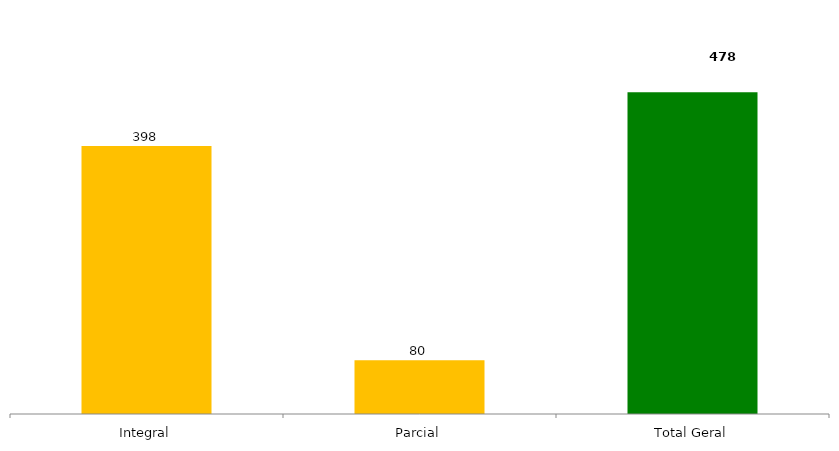
| Category | Categoria/Ano |
|---|---|
| Integral | 398 |
| Parcial | 80 |
| Total Geral | 478 |